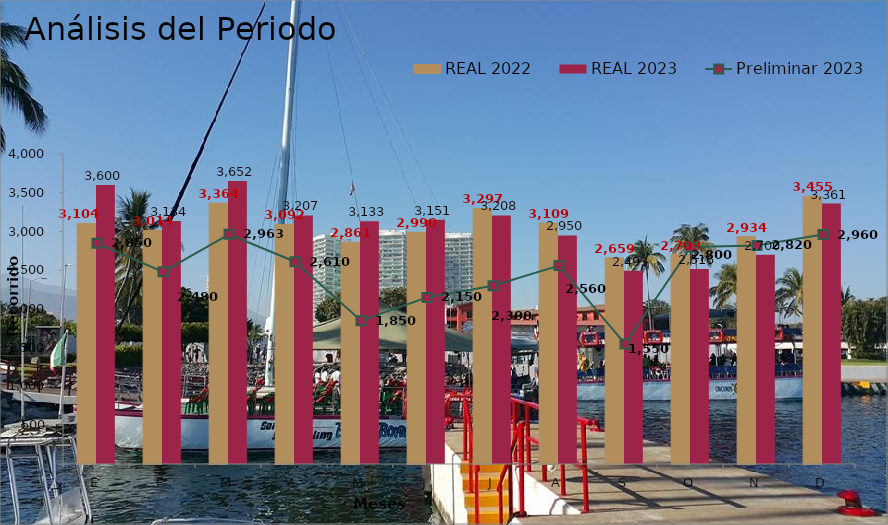
| Category | REAL 2022 | REAL 2023 |
|---|---|---|
| E | 3104 | 3600 |
| F | 3014 | 3134 |
| M | 3364 | 3652 |
| A | 3092 | 3207 |
| M | 2861 | 3133 |
| J | 2990 | 3151 |
| J | 3297 | 3208 |
| A | 3109 | 2950 |
| S | 2659 | 2493 |
| O | 2703 | 2516 |
| N | 2934 | 2700 |
| D | 3455 | 3361 |